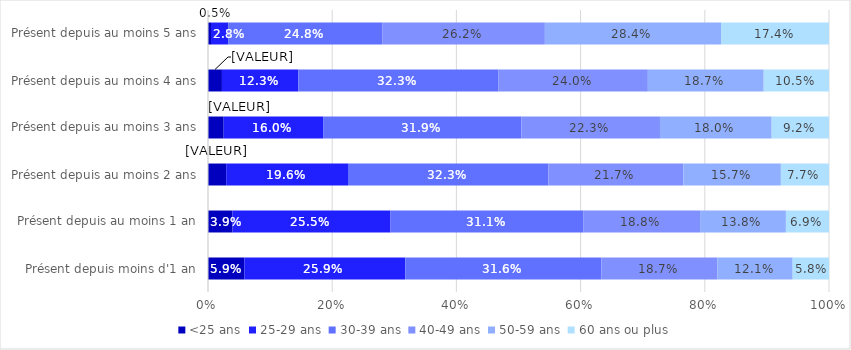
| Category |  <25 ans  |  25-29 ans  |  30-39 ans  |  40-49 ans  |  50-59 ans  |  60 ans ou plus  |
|---|---|---|---|---|---|---|
| Présent depuis moins d'1 an | 0.059 | 0.259 | 0.316 | 0.187 | 0.121 | 0.058 |
| Présent depuis au moins 1 an | 0.039 | 0.255 | 0.311 | 0.188 | 0.138 | 0.069 |
| Présent depuis au moins 2 ans | 0.029 | 0.196 | 0.323 | 0.217 | 0.157 | 0.077 |
| Présent depuis au moins 3 ans | 0.025 | 0.16 | 0.319 | 0.223 | 0.18 | 0.092 |
| Présent depuis au moins 4 ans | 0.022 | 0.123 | 0.323 | 0.24 | 0.187 | 0.105 |
| Présent depuis au moins 5 ans | 0.005 | 0.028 | 0.248 | 0.262 | 0.284 | 0.174 |